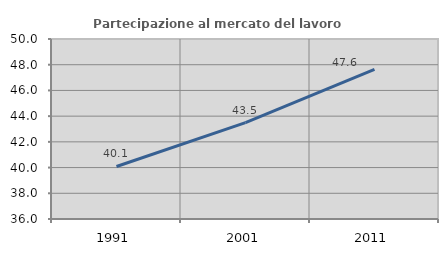
| Category | Partecipazione al mercato del lavoro  femminile |
|---|---|
| 1991.0 | 40.085 |
| 2001.0 | 43.49 |
| 2011.0 | 47.639 |